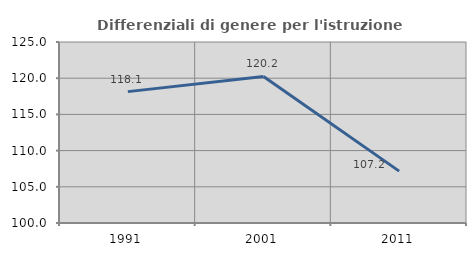
| Category | Differenziali di genere per l'istruzione superiore |
|---|---|
| 1991.0 | 118.146 |
| 2001.0 | 120.236 |
| 2011.0 | 107.164 |